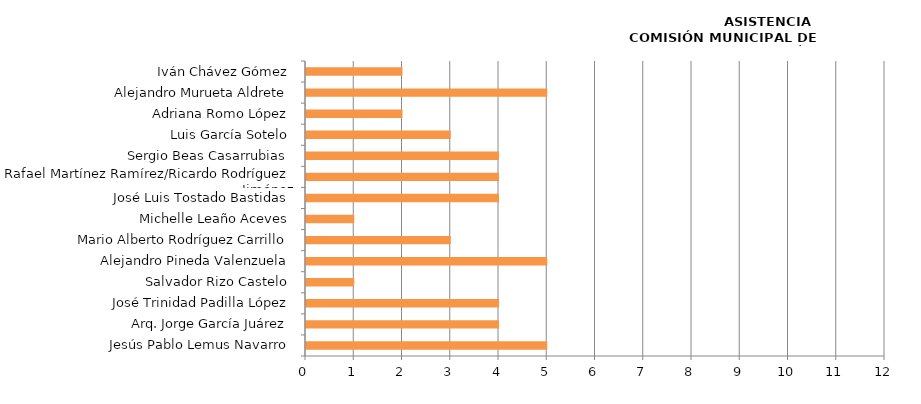
| Category | Series 0 |
|---|---|
| Jesús Pablo Lemus Navarro | 5 |
| Arq. Jorge García Juárez | 4 |
| José Trinidad Padilla López | 4 |
| Salvador Rizo Castelo | 1 |
| Alejandro Pineda Valenzuela | 5 |
| Mario Alberto Rodríguez Carrillo | 3 |
| Michelle Leaño Aceves | 1 |
| José Luis Tostado Bastidas | 4 |
| Rafael Martínez Ramírez/Ricardo Rodríguez Jiménez | 4 |
| Sergio Beas Casarrubias | 4 |
| Luis García Sotelo | 3 |
| Adriana Romo López | 2 |
| Alejandro Murueta Aldrete | 5 |
| Iván Chávez Gómez | 2 |